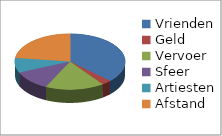
| Category | Series 0 | Series 1 |
|---|---|---|
| Vrienden | 13 | 1 |
| Geld | 1 | 0.077 |
| Vervoer | 6 | 0.462 |
| Sfeer | 4 | 0.308 |
| Artiesten | 3 | 0.231 |
| Afstand | 8 | 0.615 |